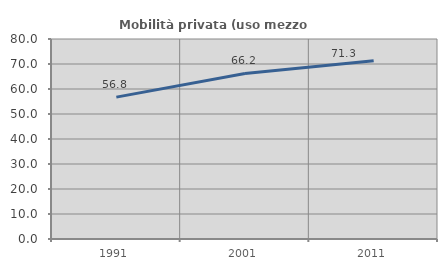
| Category | Mobilità privata (uso mezzo privato) |
|---|---|
| 1991.0 | 56.75 |
| 2001.0 | 66.2 |
| 2011.0 | 71.313 |